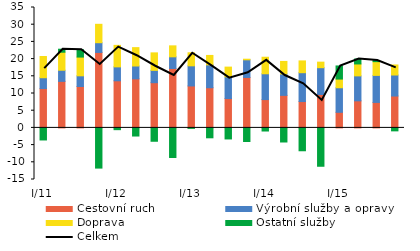
| Category | Cestovní ruch  | Výrobní služby a opravy | Doprava | Ostatní služby |
|---|---|---|---|---|
| I/11 | 11.431 | 3.156 | 6.162 | -3.509 |
| II | 13.528 | 3.236 | 5.236 | 0.875 |
| III | 12.037 | 3.104 | 5.449 | 2.149 |
| IV | 21.941 | 2.823 | 5.35 | -11.684 |
| I/12 | 13.692 | 4.048 | 6.252 | -0.513 |
| II | 14.269 | 3.724 | 5.341 | -2.361 |
| III | 13.14 | 3.585 | 5.083 | -3.885 |
| IV | 17.276 | 3.385 | 3.188 | -8.597 |
| I/13 | 12.195 | 5.852 | 3.788 | -0.133 |
| II | 11.675 | 6.652 | 2.738 | -2.878 |
| III | 8.529 | 6.323 | 2.82 | -3.214 |
| IV | 14.674 | 5.118 | 0.175 | -3.954 |
| I/14 | 8.232 | 7.501 | 4.806 | -0.903 |
| II | 9.456 | 6.22 | 3.647 | -4.097 |
| III | 7.658 | 8.387 | 3.426 | -6.647 |
| IV | 9.714 | 7.786 | 1.615 | -11.151 |
| I/15 | 4.536 | 7.134 | 2.527 | 3.81 |
| II | 7.866 | 7.26 | 3.463 | 1.434 |
| III | 7.408 | 7.851 | 4.002 | 0.319 |
| IV | 9.267 | 6.106 | 2.919 | -0.86 |